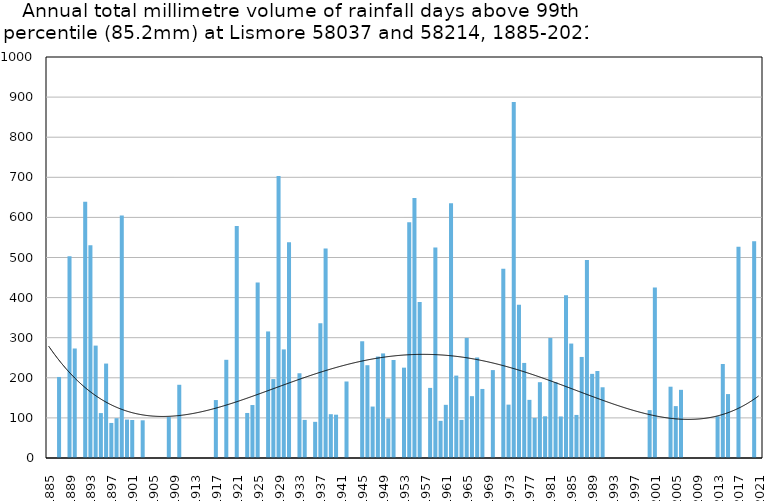
| Category | Annual total mm in days above 99th percentile |
|---|---|
| 1885 | 0 |
| 1886 | 0 |
| 1887 | 202.1 |
| 1888 | 0 |
| 1889 | 503.4 |
| 1890 | 273.1 |
| 1891 | 0 |
| 1892 | 639.2 |
| 1893 | 530.3 |
| 1894 | 280.3 |
| 1895 | 112 |
| 1896 | 235.5 |
| 1897 | 87.4 |
| 1898 | 99.3 |
| 1899 | 604.6 |
| 1900 | 95.8 |
| 1901 | 94.7 |
| 1902 | 0 |
| 1903 | 94 |
| 1904 | 0 |
| 1905 | 0 |
| 1906 | 0 |
| 1907 | 0 |
| 1908 | 102.6 |
| 1909 | 0 |
| 1910 | 182.6 |
| 1911 | 0 |
| 1912 | 0 |
| 1913 | 0 |
| 1914 | 0 |
| 1915 | 0 |
| 1916 | 0 |
| 1917 | 144.5 |
| 1918 | 0 |
| 1919 | 244.9 |
| 1920 | 0 |
| 1921 | 578.8 |
| 1922 | 0 |
| 1923 | 112.3 |
| 1924 | 132.1 |
| 1925 | 437.7 |
| 1926 | 0 |
| 1927 | 315.6 |
| 1928 | 196.8 |
| 1929 | 703.5 |
| 1930 | 270.8 |
| 1931 | 538.3 |
| 1932 | 0 |
| 1933 | 211.3 |
| 1934 | 95 |
| 1935 | 0 |
| 1936 | 90.2 |
| 1937 | 335.8 |
| 1938 | 522.4 |
| 1939 | 109.2 |
| 1940 | 108 |
| 1941 | 0 |
| 1942 | 190.8 |
| 1943 | 0 |
| 1944 | 0 |
| 1945 | 291.1 |
| 1946 | 231.4 |
| 1947 | 128.3 |
| 1948 | 253 |
| 1949 | 260.8 |
| 1950 | 98.6 |
| 1951 | 244.4 |
| 1952 | 0 |
| 1953 | 225.3 |
| 1954 | 588.1 |
| 1955 | 648.4 |
| 1956 | 388.8 |
| 1957 | 0 |
| 1958 | 174.8 |
| 1959 | 524.8 |
| 1960 | 92.7 |
| 1961 | 132.6 |
| 1962 | 635.4 |
| 1963 | 205.5 |
| 1964 | 95 |
| 1965 | 299.5 |
| 1966 | 154.2 |
| 1967 | 250.7 |
| 1968 | 172.2 |
| 1969 | 0 |
| 1970 | 219.2 |
| 1971 | 0 |
| 1972 | 472.2 |
| 1973 | 133.1 |
| 1974 | 887.5 |
| 1975 | 382.3 |
| 1976 | 237.1 |
| 1977 | 145 |
| 1978 | 100 |
| 1979 | 189 |
| 1980 | 104 |
| 1981 | 299.4 |
| 1982 | 189 |
| 1983 | 103.6 |
| 1984 | 405.6 |
| 1985 | 285.4 |
| 1986 | 107.4 |
| 1987 | 252 |
| 1988 | 493.8 |
| 1989 | 209.8 |
| 1990 | 217 |
| 1991 | 176.4 |
| 1992 | 0 |
| 1993 | 0 |
| 1994 | 0 |
| 1995 | 0 |
| 1996 | 0 |
| 1997 | 0 |
| 1998 | 0 |
| 1999 | 0 |
| 2000 | 119.4 |
| 2001 | 425.4 |
| 2002 | 0 |
| 2003 | 0 |
| 2004 | 177.8 |
| 2005 | 129.4 |
| 2006 | 170 |
| 2007 | 0 |
| 2008 | 0 |
| 2009 | 0 |
| 2010 | 0 |
| 2011 | 0 |
| 2012 | 0 |
| 2013 | 104 |
| 2014 | 234.4 |
| 2015 | 159.4 |
| 2016 | 0 |
| 2017 | 526.6 |
| 2018 | 0 |
| 2019 | 0 |
| 2020 | 540.4 |
| 2021 | 0 |